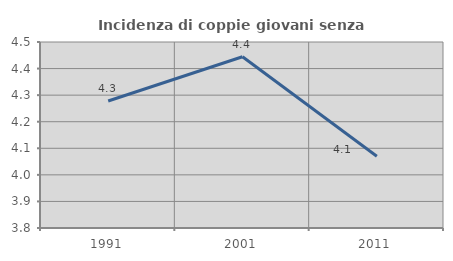
| Category | Incidenza di coppie giovani senza figli |
|---|---|
| 1991.0 | 4.278 |
| 2001.0 | 4.444 |
| 2011.0 | 4.07 |